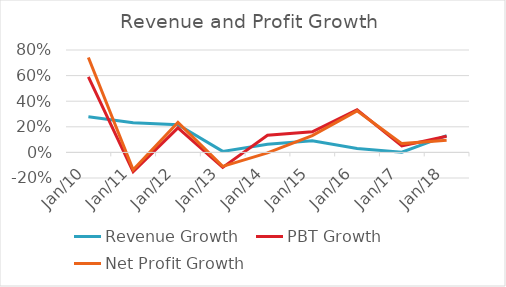
| Category | Revenue Growth | PBT Growth | Net Profit Growth |
|---|---|---|---|
| Mar-10 | 0.279 | 0.59 | 0.741 |
| Mar-11 | 0.231 | -0.151 | -0.136 |
| Mar-12 | 0.216 | 0.191 | 0.234 |
| Mar-13 | 0.008 | -0.117 | -0.109 |
| Mar-14 | 0.063 | 0.134 | -0.004 |
| Mar-15 | 0.091 | 0.161 | 0.131 |
| Mar-16 | 0.031 | 0.332 | 0.325 |
| Mar-17 | 0.002 | 0.05 | 0.069 |
| Mar-18 | 0.131 | 0.126 | 0.095 |